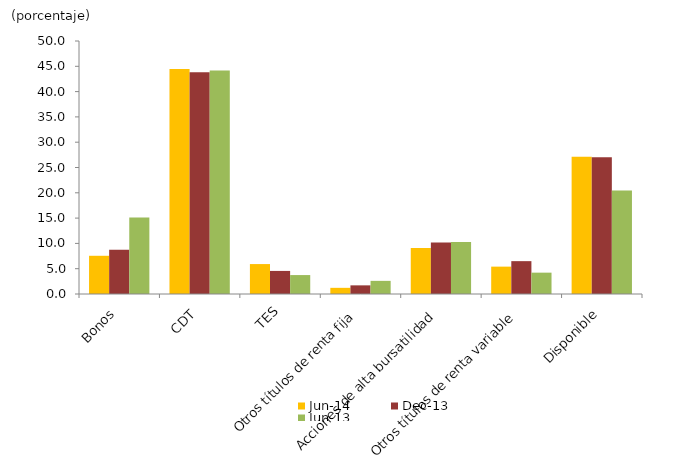
| Category | jun-14 | dic-13 | jun-13 |
|---|---|---|---|
| Bonos | 7.553 | 8.75 | 15.103 |
| CDT | 44.444 | 43.811 | 44.147 |
| TES | 5.914 | 4.561 | 3.742 |
| Otros títulos de renta fija | 1.22 | 1.708 | 2.597 |
| Acciones de alta bursatilidad | 9.069 | 10.162 | 10.285 |
| Otros títulos de renta variable | 5.409 | 6.492 | 4.22 |
| Disponible | 27.112 | 27.036 | 20.434 |